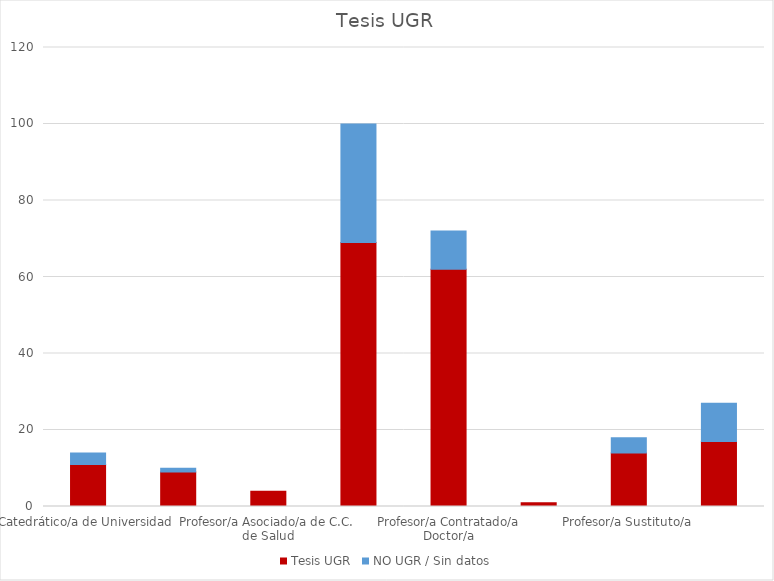
| Category | Tesis UGR | NO UGR / Sin datos |
|---|---|---|
| Catedrático/a de Universidad | 11 | 3 |
| Profesor/a Asociado/a  | 9 | 1 |
| Profesor/a Asociado/a de C.C. de Salud | 4 | 0 |
| Profesor/a Ayudante/a Doctor/a | 69 | 31 |
| Profesor/a Contratado/a Doctor/a | 62 | 10 |
| Profesor/a Emérito/a | 1 | 0 |
| Profesor/a Sustituto/a | 14 | 4 |
| Profesor/a Titular de Universidad | 17 | 10 |